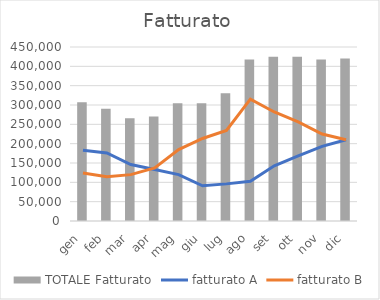
| Category | TOTALE Fatturato |
|---|---|
| gen | 307300 |
| feb | 290400 |
| mar | 265900 |
| apr | 270500 |
| mag | 304800 |
| giu | 304400 |
| lug | 330300 |
| ago | 417850 |
| set | 424800 |
| ott | 424800 |
| nov | 417950 |
| dic | 419950 |